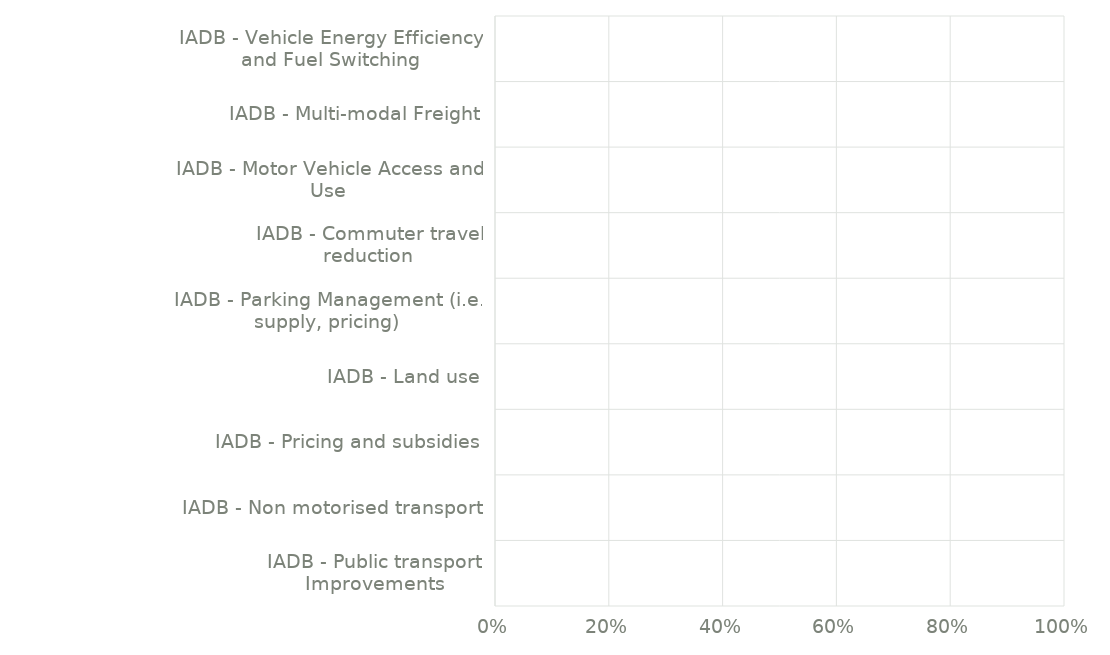
| Category | Climate Impact |
|---|---|
| IADB - Public transport Improvements | 0 |
| IADB - Non motorised transport | 0 |
| IADB - Pricing and subsidies | 0 |
| IADB - Land use | 0 |
| IADB - Parking Management (i.e. supply, pricing) | 0 |
| IADB - Commuter travel reduction | 0 |
| IADB - Motor Vehicle Access and Use | 0 |
| IADB - Multi-modal Freight | 0 |
| IADB - Vehicle Energy Efficiency and Fuel Switching | 0 |